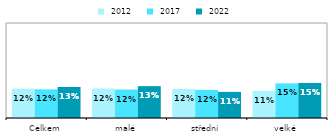
| Category |  2012 |  2017 |  2022 |
|---|---|---|---|
| Celkem | 0.123 | 0.121 | 0.131 |
| malé | 0.124 | 0.12 | 0.134 |
| střední | 0.123 | 0.118 | 0.11 |
| velké | 0.114 | 0.146 | 0.148 |